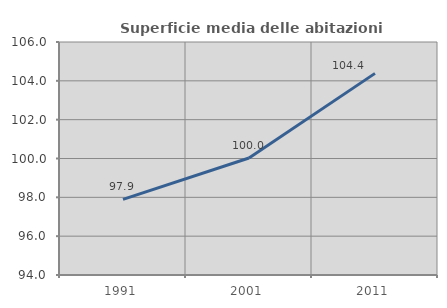
| Category | Superficie media delle abitazioni occupate |
|---|---|
| 1991.0 | 97.896 |
| 2001.0 | 100.024 |
| 2011.0 | 104.384 |